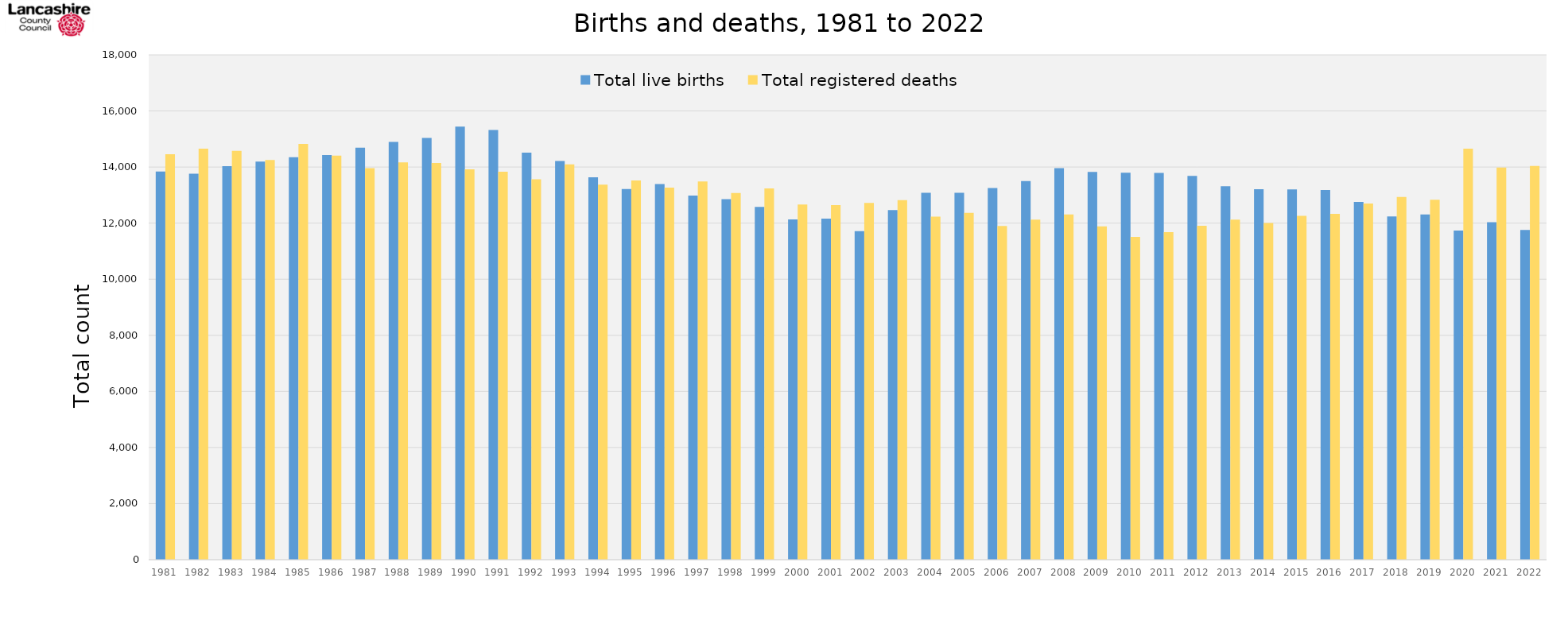
| Category | Total live births | Total registered deaths |
|---|---|---|
| 1981.0 | 13839 | 14458 |
| 1982.0 | 13759 | 14654 |
| 1983.0 | 14030 | 14577 |
| 1984.0 | 14191 | 14248 |
| 1985.0 | 14352 | 14826 |
| 1986.0 | 14425 | 14409 |
| 1987.0 | 14688 | 13961 |
| 1988.0 | 14899 | 14165 |
| 1989.0 | 15037 | 14147 |
| 1990.0 | 15442 | 13917 |
| 1991.0 | 15324 | 13836 |
| 1992.0 | 14510 | 13566 |
| 1993.0 | 14213 | 14094 |
| 1994.0 | 13637 | 13373 |
| 1995.0 | 13215 | 13521 |
| 1996.0 | 13391 | 13265 |
| 1997.0 | 12980 | 13486 |
| 1998.0 | 12856 | 13072 |
| 1999.0 | 12577 | 13235 |
| 2000.0 | 12132 | 12664 |
| 2001.0 | 12164 | 12645 |
| 2002.0 | 11716 | 12721 |
| 2003.0 | 12463 | 12823 |
| 2004.0 | 13082 | 12230 |
| 2005.0 | 13084 | 12364 |
| 2006.0 | 13249 | 11898 |
| 2007.0 | 13503 | 12123 |
| 2008.0 | 13963 | 12306 |
| 2009.0 | 13829 | 11886 |
| 2010.0 | 13797 | 11508 |
| 2011.0 | 13794 | 11676 |
| 2012.0 | 13681 | 11903 |
| 2013.0 | 13317 | 12125 |
| 2014.0 | 13210 | 12002 |
| 2015.0 | 13202 | 12259 |
| 2016.0 | 13183 | 12333 |
| 2017.0 | 12757 | 12697 |
| 2018.0 | 12238 | 12930 |
| 2019.0 | 12306 | 12831 |
| 2020.0 | 11736 | 14652 |
| 2021.0 | 12035 | 13985 |
| 2022.0 | 11754 | 14039 |